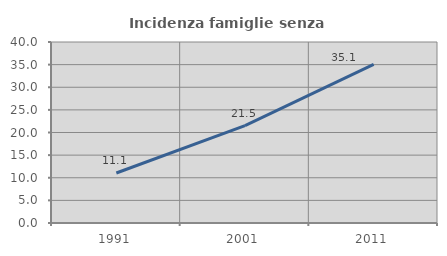
| Category | Incidenza famiglie senza nuclei |
|---|---|
| 1991.0 | 11.053 |
| 2001.0 | 21.512 |
| 2011.0 | 35.052 |